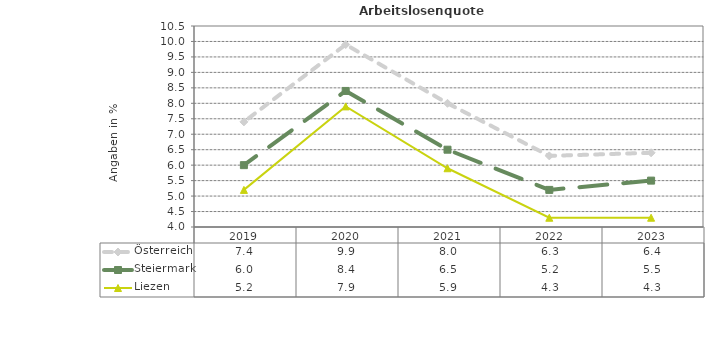
| Category | Österreich | Steiermark | Liezen |
|---|---|---|---|
| 2023.0 | 6.4 | 5.5 | 4.3 |
| 2022.0 | 6.3 | 5.2 | 4.3 |
| 2021.0 | 8 | 6.5 | 5.9 |
| 2020.0 | 9.9 | 8.4 | 7.9 |
| 2019.0 | 7.4 | 6 | 5.2 |